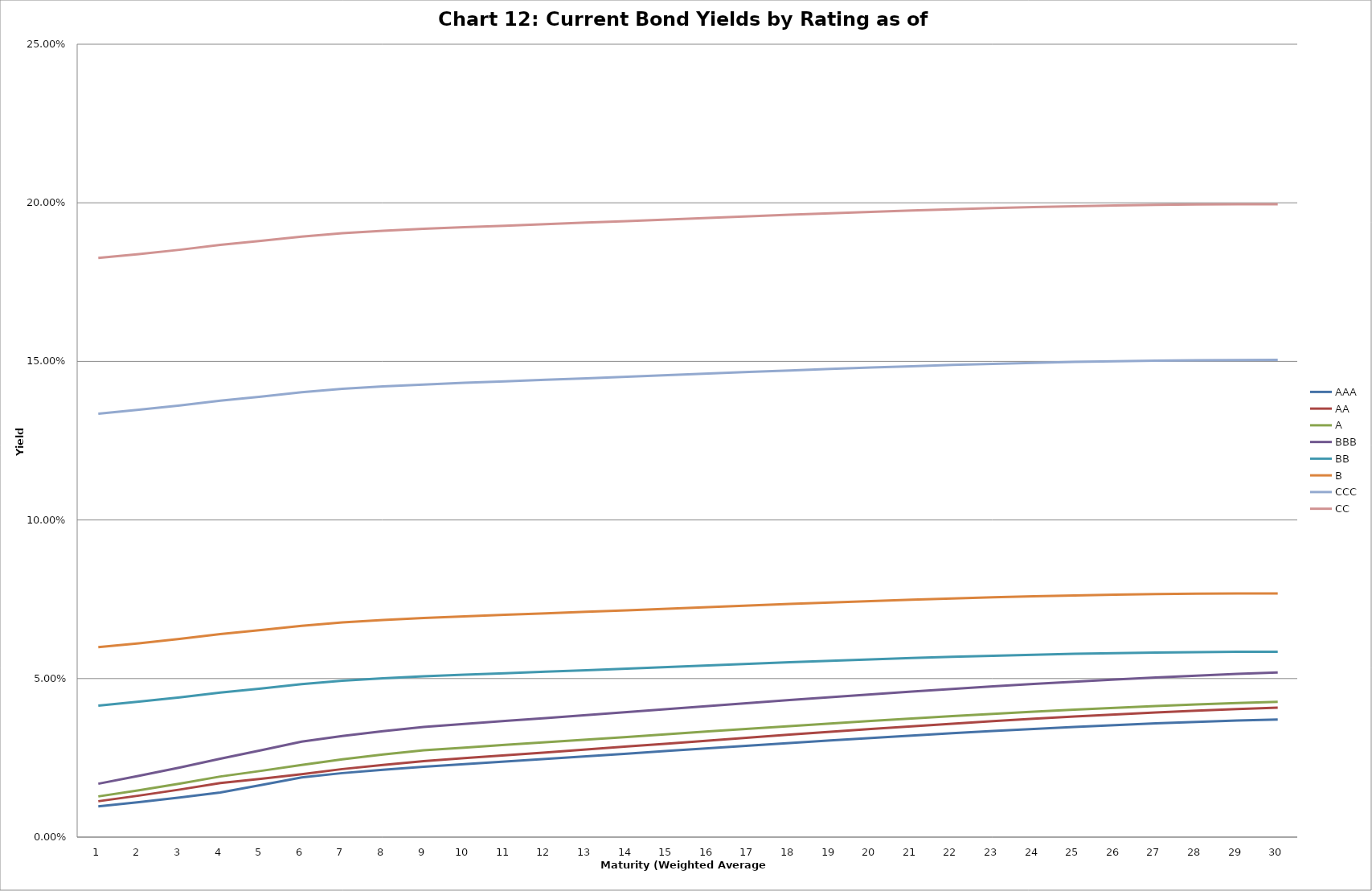
| Category | AAA | AA | A | BBB | BB | B | CCC | CC |
|---|---|---|---|---|---|---|---|---|
| 0 | 0.01 | 0.011 | 0.013 | 0.017 | 0.041 | 0.06 | 0.134 | 0.183 |
| 1 | 0.011 | 0.013 | 0.015 | 0.019 | 0.043 | 0.061 | 0.135 | 0.184 |
| 2 | 0.012 | 0.015 | 0.017 | 0.022 | 0.044 | 0.062 | 0.136 | 0.185 |
| 3 | 0.014 | 0.017 | 0.019 | 0.025 | 0.046 | 0.064 | 0.138 | 0.187 |
| 4 | 0.016 | 0.018 | 0.021 | 0.027 | 0.047 | 0.065 | 0.139 | 0.188 |
| 5 | 0.019 | 0.02 | 0.023 | 0.03 | 0.048 | 0.067 | 0.14 | 0.189 |
| 6 | 0.02 | 0.021 | 0.025 | 0.032 | 0.049 | 0.068 | 0.141 | 0.19 |
| 7 | 0.021 | 0.023 | 0.026 | 0.033 | 0.05 | 0.068 | 0.142 | 0.191 |
| 8 | 0.022 | 0.024 | 0.027 | 0.035 | 0.051 | 0.069 | 0.143 | 0.192 |
| 9 | 0.023 | 0.025 | 0.028 | 0.036 | 0.051 | 0.07 | 0.143 | 0.192 |
| 10 | 0.024 | 0.026 | 0.029 | 0.037 | 0.052 | 0.07 | 0.144 | 0.193 |
| 11 | 0.025 | 0.027 | 0.03 | 0.038 | 0.052 | 0.071 | 0.144 | 0.193 |
| 12 | 0.025 | 0.028 | 0.031 | 0.038 | 0.053 | 0.071 | 0.145 | 0.194 |
| 13 | 0.026 | 0.029 | 0.032 | 0.039 | 0.053 | 0.072 | 0.145 | 0.194 |
| 14 | 0.027 | 0.03 | 0.032 | 0.04 | 0.054 | 0.072 | 0.146 | 0.195 |
| 15 | 0.028 | 0.03 | 0.033 | 0.041 | 0.054 | 0.073 | 0.146 | 0.195 |
| 16 | 0.029 | 0.031 | 0.034 | 0.042 | 0.055 | 0.073 | 0.147 | 0.196 |
| 17 | 0.03 | 0.032 | 0.035 | 0.043 | 0.055 | 0.074 | 0.147 | 0.196 |
| 18 | 0.03 | 0.033 | 0.036 | 0.044 | 0.056 | 0.074 | 0.148 | 0.197 |
| 19 | 0.031 | 0.034 | 0.037 | 0.045 | 0.056 | 0.074 | 0.148 | 0.197 |
| 20 | 0.032 | 0.035 | 0.037 | 0.046 | 0.056 | 0.075 | 0.148 | 0.198 |
| 21 | 0.033 | 0.036 | 0.038 | 0.047 | 0.057 | 0.075 | 0.149 | 0.198 |
| 22 | 0.033 | 0.037 | 0.039 | 0.048 | 0.057 | 0.076 | 0.149 | 0.198 |
| 23 | 0.034 | 0.037 | 0.04 | 0.048 | 0.058 | 0.076 | 0.15 | 0.199 |
| 24 | 0.035 | 0.038 | 0.04 | 0.049 | 0.058 | 0.076 | 0.15 | 0.199 |
| 25 | 0.035 | 0.039 | 0.041 | 0.05 | 0.058 | 0.076 | 0.15 | 0.199 |
| 26 | 0.036 | 0.039 | 0.041 | 0.05 | 0.058 | 0.077 | 0.15 | 0.199 |
| 27 | 0.036 | 0.04 | 0.042 | 0.051 | 0.058 | 0.077 | 0.15 | 0.199 |
| 28 | 0.037 | 0.04 | 0.042 | 0.051 | 0.058 | 0.077 | 0.15 | 0.2 |
| 29 | 0.037 | 0.041 | 0.043 | 0.052 | 0.058 | 0.077 | 0.15 | 0.2 |